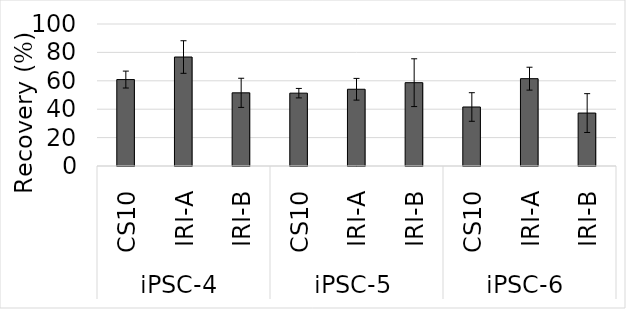
| Category | Series 0 |
|---|---|
| 0 | 60.87 |
| 1 | 76.74 |
| 2 | 51.527 |
| 3 | 51.29 |
| 4 | 54.041 |
| 5 | 58.671 |
| 6 | 41.552 |
| 7 | 61.501 |
| 8 | 37.282 |